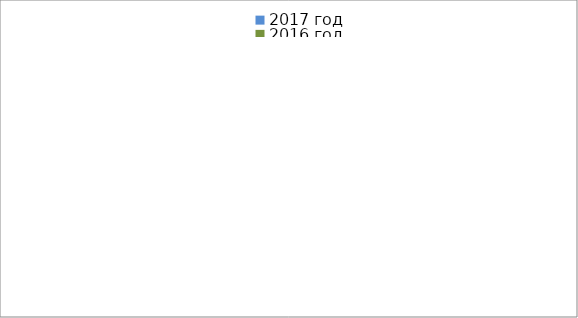
| Category | 2017 год | 2016 год |
|---|---|---|
|  - поджог | 9 | 29 |
|  - неосторожное обращение с огнём | 4 | 17 |
|  - НПТЭ электрооборудования | 11 | 10 |
|  - НПУ и Э печей | 28 | 27 |
|  - НПУ и Э транспортных средств | 35 | 16 |
|   -Шалость с огнем детей | 3 | 5 |
|  -НППБ при эксплуатации эл.приборов | 20 | 5 |
|  - курение | 22 | 8 |
| - прочие | 47 | 56 |
| - не установленные причины | 0 | 11 |